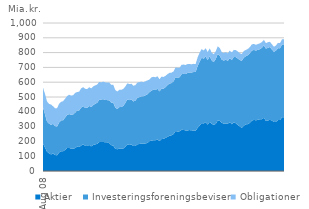
| Category | Aktier | Investeringsforeningsbeviser | Obligationer |
|---|---|---|---|
| 2008-08-01 | 186.374 | 243.824 | 132.78 |
| 2008-09-01 | 158.138 | 225.27 | 137.224 |
| 2008-10-01 | 130.57 | 203.624 | 135.853 |
| 2008-11-01 | 119.652 | 200.996 | 133.087 |
| 2008-12-01 | 111.878 | 200.063 | 137.257 |
| 2009-01-01 | 117.92 | 200.445 | 119.266 |
| 2009-02-01 | 107.935 | 195.114 | 120.472 |
| 2009-03-01 | 105.937 | 193.412 | 125.447 |
| 2009-04-01 | 124.798 | 201.695 | 126.611 |
| 2009-05-01 | 134.314 | 207.671 | 125.052 |
| 2009-06-01 | 132.947 | 209.937 | 128.64 |
| 2009-07-01 | 142.02 | 218.929 | 127.719 |
| 2009-08-01 | 155.419 | 223.197 | 127.5 |
| 2009-09-01 | 155.835 | 228.844 | 130.776 |
| 2009-10-01 | 150.917 | 228.7 | 130.173 |
| 2009-11-01 | 150.057 | 232.254 | 129.449 |
| 2009-12-01 | 154.816 | 239.358 | 133.747 |
| 2010-01-01 | 164.805 | 244.01 | 124.739 |
| 2010-02-01 | 162.035 | 247.51 | 126.719 |
| 2010-03-01 | 171.865 | 256.598 | 129.672 |
| 2010-04-01 | 181.126 | 257.834 | 127.553 |
| 2010-05-01 | 170.095 | 256.199 | 129.145 |
| 2010-06-01 | 168.521 | 258.564 | 126.651 |
| 2010-07-01 | 176.23 | 263.403 | 126.194 |
| 2010-08-01 | 166.379 | 264.955 | 127.275 |
| 2010-09-01 | 175.662 | 269.956 | 125.916 |
| 2010-10-01 | 179.996 | 274.175 | 124.188 |
| 2010-11-01 | 183.234 | 278.184 | 122.649 |
| 2010-12-01 | 195.408 | 284.74 | 121.97 |
| 2011-01-01 | 196.725 | 286.865 | 115.89 |
| 2011-02-01 | 196.536 | 288.641 | 118.864 |
| 2011-03-01 | 193.692 | 286.429 | 118.771 |
| 2011-04-01 | 194.33 | 284.612 | 119.428 |
| 2011-05-01 | 187.753 | 289.231 | 120.425 |
| 2011-06-01 | 174.038 | 287.221 | 120.972 |
| 2011-07-01 | 171.514 | 289.531 | 121.206 |
| 2011-08-01 | 149.864 | 278.137 | 118.981 |
| 2011-09-01 | 146.724 | 272.69 | 118.024 |
| 2011-10-01 | 151.106 | 280.258 | 117.107 |
| 2011-11-01 | 152.211 | 280.835 | 115.884 |
| 2011-12-01 | 152.249 | 286.826 | 115.65 |
| 2012-01-01 | 163.983 | 296.805 | 109.911 |
| 2012-02-01 | 179.122 | 303.701 | 109.698 |
| 2012-03-01 | 175.696 | 302.9 | 109.457 |
| 2012-04-01 | 179.494 | 303.637 | 105.759 |
| 2012-05-01 | 168.62 | 301.601 | 105.806 |
| 2012-06-01 | 169.345 | 306.124 | 104.692 |
| 2012-07-01 | 180.095 | 314.8 | 102.702 |
| 2012-08-01 | 182.53 | 315.938 | 102.482 |
| 2012-09-01 | 185.99 | 319.029 | 99.2 |
| 2012-10-01 | 183.777 | 320.527 | 95.912 |
| 2012-11-01 | 186.418 | 325.193 | 94.753 |
| 2012-12-01 | 189.524 | 328.751 | 94.006 |
| 2013-01-01 | 200.819 | 331.704 | 85.095 |
| 2013-02-01 | 206.063 | 337.505 | 89.62 |
| 2013-03-01 | 207.471 | 341.181 | 87.699 |
| 2013-04-01 | 207.972 | 339.326 | 85.797 |
| 2013-05-01 | 212.196 | 343.09 | 84.815 |
| 2013-06-01 | 202.807 | 334.314 | 83.168 |
| 2013-07-01 | 215.398 | 340.885 | 81.078 |
| 2013-08-01 | 217.585 | 337.992 | 79.969 |
| 2013-09-01 | 224.049 | 343.028 | 75.471 |
| 2013-10-01 | 230.732 | 350.466 | 73.755 |
| 2013-11-01 | 237.953 | 352.69 | 72.323 |
| 2013-12-01 | 241.182 | 353.05 | 70.305 |
| 2014-01-01 | 249.232 | 356.73 | 67.006 |
| 2014-02-01 | 270.253 | 363.043 | 66.511 |
| 2014-03-01 | 266.547 | 364.511 | 66.322 |
| 2014-04-01 | 268.053 | 365.215 | 64.52 |
| 2014-05-01 | 278.091 | 376.023 | 63.928 |
| 2014-06-01 | 277.655 | 378.841 | 62.516 |
| 2014-07-01 | 274.001 | 381.474 | 60.884 |
| 2014-08-01 | 273.75 | 388.441 | 60.635 |
| 2014-09-01 | 276.575 | 388.483 | 57.856 |
| 2014-10-01 | 274.88 | 390.986 | 55.353 |
| 2014-11-01 | 272.229 | 396.237 | 55.443 |
| 2014-12-01 | 271.257 | 398.452 | 53.677 |
| 2015-01-01 | 291.663 | 416.904 | 59.851 |
| 2015-02-01 | 307.209 | 432.603 | 60.303 |
| 2015-03-01 | 323.867 | 440.889 | 59.144 |
| 2015-04-01 | 321.187 | 437.739 | 55.635 |
| 2015-05-01 | 329.986 | 444.176 | 55.192 |
| 2015-06-01 | 313.083 | 436.028 | 54.492 |
| 2015-07-01 | 332.074 | 443.33 | 53.07 |
| 2015-08-01 | 318.093 | 429.042 | 52.957 |
| 2015-09-01 | 312.673 | 423.045 | 53.122 |
| 2015-10-01 | 317.546 | 438.849 | 52.558 |
| 2015-11-01 | 341.208 | 449.021 | 52.182 |
| 2015-12-01 | 338.687 | 439.652 | 52.75 |
| 2016-01-01 | 325.443 | 426.873 | 50.983 |
| 2016-02-01 | 319.834 | 425.976 | 51.413 |
| 2016-03-01 | 319.303 | 432.742 | 51.165 |
| 2016-04-01 | 320.025 | 423.933 | 51.063 |
| 2016-05-01 | 329.159 | 433.522 | 51.029 |
| 2016-06-01 | 315.915 | 433.381 | 51.428 |
| 2016-07-01 | 327.806 | 442.753 | 47.948 |
| 2016-08-01 | 322.818 | 446.589 | 47.682 |
| 2016-09-01 | 311.08 | 448.613 | 47.76 |
| 2016-10-01 | 300.822 | 448.769 | 46.162 |
| 2016-11-01 | 291.042 | 453.369 | 45.839 |
| 2016-12-01 | 306.344 | 459.601 | 44.955 |
| 2017-01-01 | 315.141 | 460.178 | 42.708 |
| 2017-02-01 | 316.899 | 465.082 | 43.081 |
| 2017-03-01 | 325.396 | 469.324 | 42.579 |
| 2017-04-01 | 340.392 | 473.453 | 41.744 |
| 2017-05-01 | 345.504 | 472.792 | 39.992 |
| 2017-06-01 | 342.452 | 471.14 | 39.54 |
| 2017-07-01 | 345.912 | 472.888 | 39.049 |
| 2017-08-01 | 349.336 | 474.163 | 39.295 |
| 2017-09-01 | 350.394 | 481.845 | 38.713 |
| 2017-10-01 | 359.085 | 489.433 | 37.822 |
| 2017-11-01 | 337.927 | 488.823 | 37.351 |
| 2017-12-01 | 341.466 | 490.925 | 38.028 |
| 2018-01-01 | 345.654 | 491.621 | 35.734 |
| 2018-02-01 | 340.727 | 479.968 | 34.979 |
| 2018-03-01 | 330.455 | 475.064 | 33.987 |
| 2018-04-01 | 332.191 | 481.343 | 34.91 |
| 2018-05-01 | 343.864 | 486.618 | 35.437 |
| 2018-06-01 | 344.044 | 484.892 | 35.407 |
| 2018-07-01 | 362.482 | 492.062 | 34.84 |
| 2018-08-01 | 363.207 | 492.476 | 35.095 |